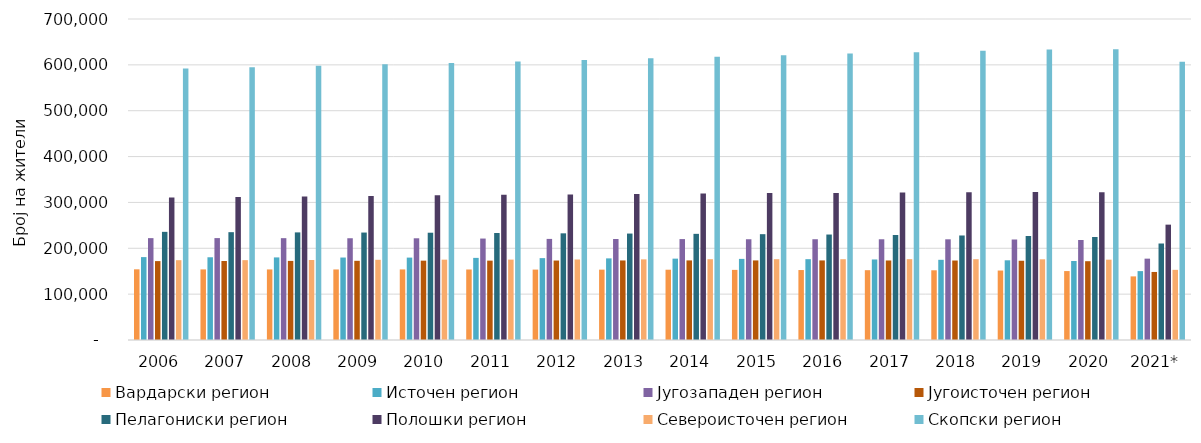
| Category | Вардарски регион | Источен регион | Југозападен регион | Југоисточен регион | Пелагониски регион | Полошки регион | Североисточен регион | Скопски регион |
|---|---|---|---|---|---|---|---|---|
| 2006 | 154161 | 180791 | 222141 | 172067 | 235861 | 310853 | 174076 | 591991 |
| 2007 | 153929 | 180422 | 222221 | 172238 | 235141 | 312106 | 174139 | 594981 |
| 2008 | 153872 | 180100 | 222064 | 172485 | 234659 | 313110 | 174415 | 597914 |
| 2009 | 153837 | 179846 | 221899 | 172693 | 234320 | 314194 | 174876 | 601057 |
| 2010 | 153880 | 179695 | 221811 | 173024 | 233952 | 315413 | 175211 | 604298 |
| 2011 | 153764 | 179080 | 221219 | 173083 | 233306 | 316517 | 175323 | 607502 |
| 2012 | 153554 | 178551 | 220455 | 173291 | 232618 | 317490 | 175560 | 610775 |
| 2013 | 153422 | 177988 | 220199 | 173472 | 232113 | 318458 | 175863 | 614254 |
| 2014 | 153272 | 177411 | 220065 | 173572 | 231500 | 319532 | 176174 | 617646 |
| 2015 | 152917 | 176877 | 219718 | 173552 | 230771 | 320299 | 176231 | 620913 |
| 2016 | 152571 | 176262 | 219740 | 173545 | 230004 | 320826 | 176169 | 624585 |
| 2017 | 152249 | 175616 | 219663 | 173405 | 228977 | 321573 | 176260 | 627558 |
| 2018 | 152022 | 174877 | 219580 | 173327 | 227919 | 322338 | 176196 | 630873 |
| 2019 | 151492 | 173804 | 219180 | 172824 | 226837 | 322872 | 175973 | 633273 |
| 2020 | 150319 | 172277 | 218114 | 171840 | 224670 | 322166 | 175171 | 634251 |
| 2021* | 138722 | 150234 | 177398 | 148387 | 210431 | 251552 | 152982 | 607007 |